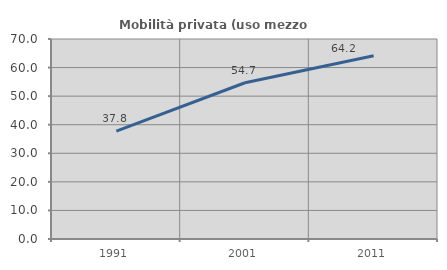
| Category | Mobilità privata (uso mezzo privato) |
|---|---|
| 1991.0 | 37.771 |
| 2001.0 | 54.679 |
| 2011.0 | 64.169 |